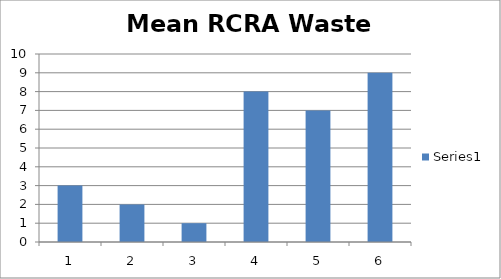
| Category | Series 0 |
|---|---|
| 0 | 3 |
| 1 | 2 |
| 2 | 1 |
| 3 | 8 |
| 4 | 7 |
| 5 | 9 |